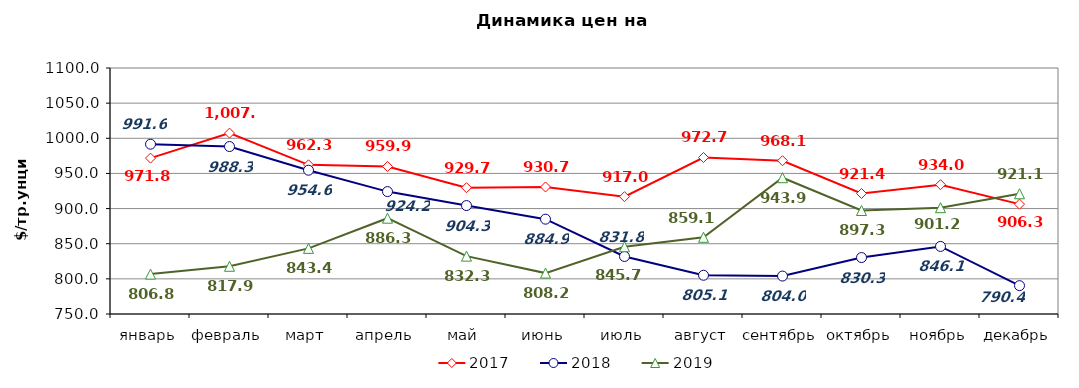
| Category | 2017 | 2018 | 2019 |
|---|---|---|---|
| январь | 971.76 | 991.6 | 806.77 |
| февраль | 1007.35 | 988.25 | 817.9 |
| март | 962.26 | 954.57 | 843.4 |
| апрель | 959.89 | 924.16 | 886.3 |
| май | 929.71 | 904.29 | 832.333 |
| июнь | 930.73 | 884.9 | 808.2 |
| июль | 916.95 | 831.84 | 845.714 |
| август | 972.67 | 805.11 | 859.143 |
| сентябрь | 968.1 | 803.98 | 943.905 |
| октябрь | 921.43 | 830.32 | 897.261 |
| ноябрь | 934 | 846.14 | 901.238 |
| декабрь | 906.32 | 790.35 | 921.06 |